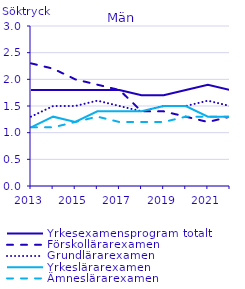
| Category | Yrkesexamensprogram totalt | Förskollärarexamen                                 | Grundlärarexamen                                   | Yrkeslärarexamen                                   | Ämneslärarexamen                                   |
|---|---|---|---|---|---|
| 2013.0 | 1.8 | 2.3 | 1.3 | 1.1 | 1.1 |
| 2014.0 | 1.8 | 2.2 | 1.5 | 1.3 | 1.1 |
| 2015.0 | 1.8 | 2 | 1.5 | 1.2 | 1.2 |
| 2016.0 | 1.8 | 1.9 | 1.6 | 1.4 | 1.3 |
| 2017.0 | 1.8 | 1.8 | 1.5 | 1.4 | 1.2 |
| 2018.0 | 1.7 | 1.4 | 1.4 | 1.4 | 1.2 |
| 2019.0 | 1.7 | 1.4 | 1.5 | 1.5 | 1.2 |
| 2020.0 | 1.8 | 1.3 | 1.5 | 1.5 | 1.3 |
| 2021.0 | 1.9 | 1.2 | 1.6 | 1.3 | 1.3 |
| 2022.0 | 1.8 | 1.3 | 1.5 | 1.3 | 1.3 |